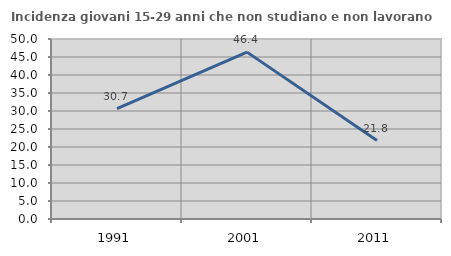
| Category | Incidenza giovani 15-29 anni che non studiano e non lavorano  |
|---|---|
| 1991.0 | 30.667 |
| 2001.0 | 46.354 |
| 2011.0 | 21.779 |